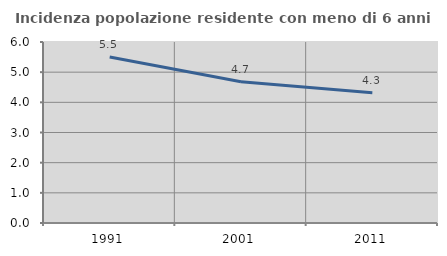
| Category | Incidenza popolazione residente con meno di 6 anni |
|---|---|
| 1991.0 | 5.504 |
| 2001.0 | 4.681 |
| 2011.0 | 4.321 |